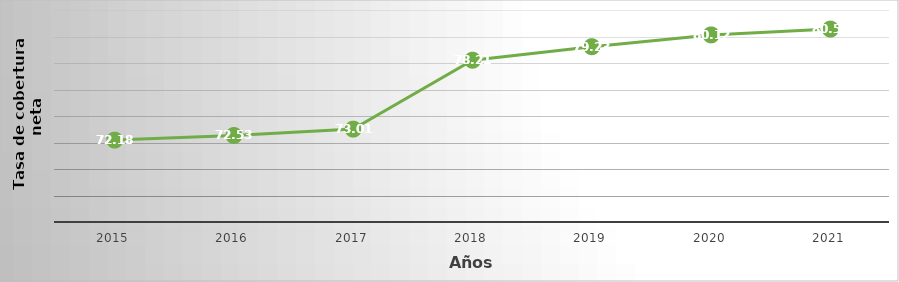
| Category | Tasa de Cobertura Neta |
|---|---|
| 2015.0 | 72.18 |
| 2016.0 | 72.53 |
| 2017.0 | 73.01 |
| 2018.0 | 78.21 |
| 2019.0 | 79.23 |
| 2020.0 | 80.12 |
| 2021.0 | 80.56 |